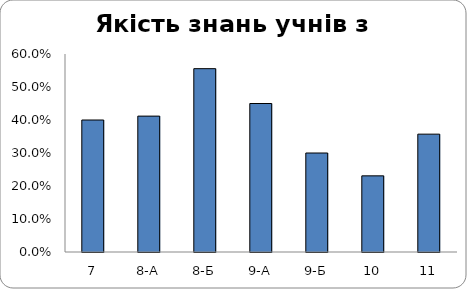
| Category | Series 0 |
|---|---|
| 7 | 0.4 |
| 8-А | 0.412 |
| 8-Б | 0.556 |
| 9-А | 0.45 |
| 9-Б | 0.3 |
| 10 | 0.231 |
| 11 | 0.357 |